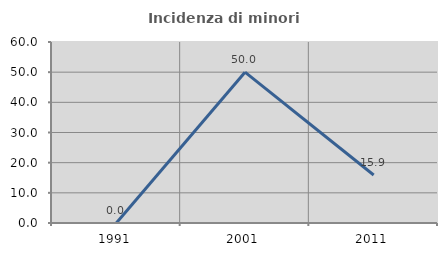
| Category | Incidenza di minori stranieri |
|---|---|
| 1991.0 | 0 |
| 2001.0 | 50 |
| 2011.0 | 15.909 |